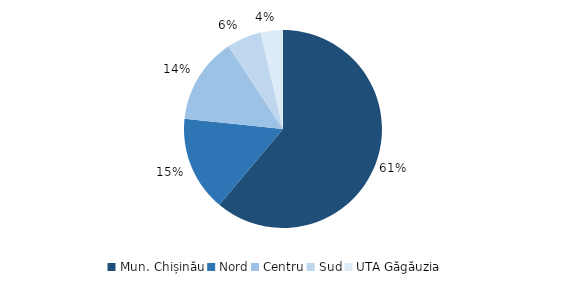
| Category | Series 0 |
|---|---|
| Mun. Chișinău | 0.607 |
| Nord | 0.154 |
| Centru | 0.14 |
| Sud | 0.056 |
| UTA Găgăuzia | 0.036 |